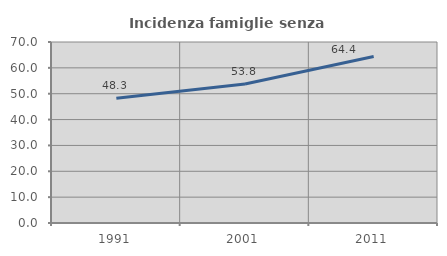
| Category | Incidenza famiglie senza nuclei |
|---|---|
| 1991.0 | 48.276 |
| 2001.0 | 53.75 |
| 2011.0 | 64.384 |